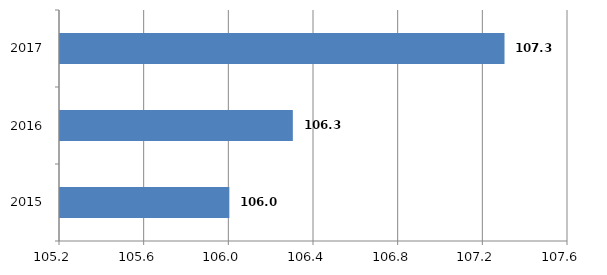
| Category | Series 0 |
|---|---|
| 2015.0 | 106 |
| 2016.0 | 106.3 |
| 2017.0 | 107.3 |